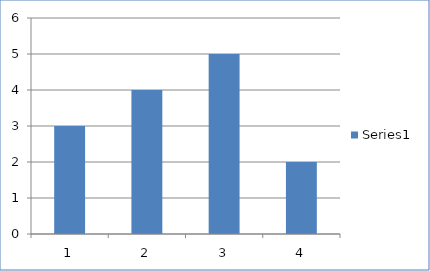
| Category | Series 0 |
|---|---|
| 0 | 3 |
| 1 | 4 |
| 2 | 5 |
| 3 | 2 |